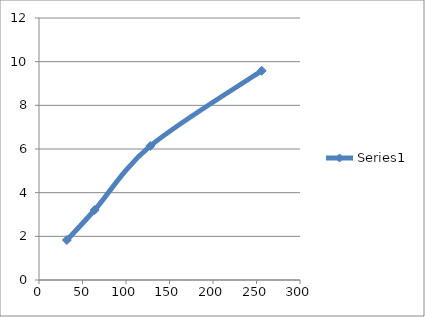
| Category | Series 0 |
|---|---|
| 32.0 | 1.829 |
| 64.0 | 3.205 |
| 128.0 | 6.141 |
| 256.0 | 9.584 |